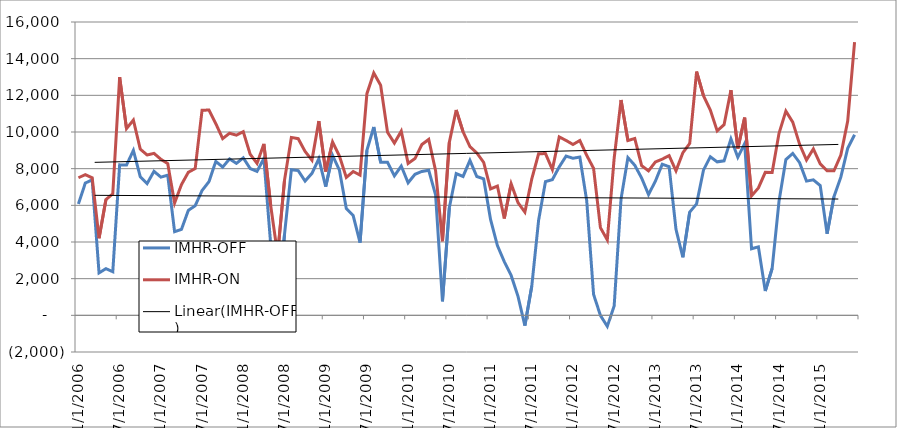
| Category | IMHR-OFF | IMHR-ON |
|---|---|---|
| 1/1/06 | 6076.565 | 7504.472 |
| 2/1/06 | 7214.78 | 7679.468 |
| 3/1/06 | 7390.984 | 7500.795 |
| 4/1/06 | 2314.162 | 4206.245 |
| 5/1/06 | 2545.737 | 6309.301 |
| 6/1/06 | 2380.073 | 6626.586 |
| 7/1/06 | 8207.34 | 12989.126 |
| 8/1/06 | 8197.156 | 10186.404 |
| 9/1/06 | 8995.354 | 10651.316 |
| 10/1/06 | 7564.125 | 9066.866 |
| 11/1/06 | 7188.25 | 8745.414 |
| 12/1/06 | 7854.965 | 8834.357 |
| 1/1/07 | 7539.033 | 8513.194 |
| 2/1/07 | 7644.48 | 8277.216 |
| 3/1/07 | 4561.361 | 6126.327 |
| 4/1/07 | 4689.67 | 7130.97 |
| 5/1/07 | 5724.833 | 7802.816 |
| 6/1/07 | 5980.364 | 8007.269 |
| 7/1/07 | 6808.305 | 11188.867 |
| 8/1/07 | 7288.511 | 11195.866 |
| 9/1/07 | 8396.359 | 10456.195 |
| 10/1/07 | 8085.724 | 9639.919 |
| 11/1/07 | 8530.538 | 9931.176 |
| 12/1/07 | 8290.111 | 9827.297 |
| 1/1/08 | 8589.036 | 10015.242 |
| 2/1/08 | 8007.624 | 8791.733 |
| 3/1/08 | 7851.382 | 8288.801 |
| 4/1/08 | 8555.825 | 9349.29 |
| 5/1/08 | 3832.882 | 5965.396 |
| 6/1/08 | 149.942 | 3302.464 |
| 7/1/08 | 4397.79 | 7364.334 |
| 8/1/08 | 7944.923 | 9705.77 |
| 9/1/08 | 7893.869 | 9635.211 |
| 10/1/08 | 7329.267 | 8942.723 |
| 11/1/08 | 7742.935 | 8467.855 |
| 12/1/08 | 8538.709 | 10594.966 |
| 1/1/09 | 7020.312 | 7845.517 |
| 2/1/09 | 8719.633 | 9452.94 |
| 3/1/09 | 7918.339 | 8685.84 |
| 4/1/09 | 5827.679 | 7526.827 |
| 5/1/09 | 5441.2 | 7842.865 |
| 6/1/09 | 3964.789 | 7644.264 |
| 7/1/09 | 9001.425 | 12090.755 |
| 8/1/09 | 10271.799 | 13220.015 |
| 9/1/09 | 8345.746 | 12545.55 |
| 10/1/09 | 8350.096 | 9988.01 |
| 11/1/09 | 7609.508 | 9399.159 |
| 12/1/09 | 8144.601 | 10046.538 |
| 1/1/10 | 7232.146 | 8287.236 |
| 2/1/10 | 7690.06 | 8548.982 |
| 3/1/10 | 7848.366 | 9318.975 |
| 4/1/10 | 7910.887 | 9594.842 |
| 5/1/10 | 6568.074 | 7891.826 |
| 6/1/10 | 766.696 | 4041.104 |
| 7/1/10 | 5864.71 | 9437.136 |
| 8/1/10 | 7734.879 | 11202.661 |
| 9/1/10 | 7576.091 | 10012.473 |
| 10/1/10 | 8450.953 | 9207.715 |
| 11/1/10 | 7572.689 | 8857.099 |
| 12/1/10 | 7442.129 | 8343.083 |
| 1/1/11 | 5229.274 | 6900.103 |
| 2/1/11 | 3805.549 | 7054.983 |
| 3/1/11 | 2931.086 | 5282.628 |
| 4/1/11 | 2177.727 | 7174.334 |
| 5/1/11 | 1037.269 | 6144.66 |
| 6/1/11 | -560.884 | 5629.52 |
| 7/1/11 | 1582.746 | 7433.902 |
| 8/1/11 | 5188.702 | 8818.644 |
| 9/1/11 | 7294.896 | 8821.181 |
| 10/1/11 | 7399.79 | 7955.901 |
| 11/1/11 | 8096.763 | 9732.072 |
| 12/1/11 | 8685.873 | 9538.119 |
| 1/1/12 | 8567.891 | 9320.123 |
| 2/1/12 | 8633.452 | 9535.164 |
| 3/1/12 | 6261.405 | 8726.52 |
| 4/1/12 | 1143.035 | 8019.476 |
| 5/1/12 | -6.784 | 4780.589 |
| 6/1/12 | -601.678 | 4111.776 |
| 7/1/12 | 521.512 | 8570.833 |
| 8/1/12 | 6348.46 | 11745.86 |
| 9/1/12 | 8602.301 | 9533.183 |
| 10/1/12 | 8184.901 | 9646.182 |
| 11/1/12 | 7486.882 | 8163.346 |
| 12/1/12 | 6589.309 | 7880.084 |
| 1/1/13 | 7317.394 | 8366.159 |
| 2/1/13 | 8241.88 | 8519.162 |
| 3/1/13 | 8107.695 | 8712.527 |
| 4/1/13 | 4691.745 | 7882.654 |
| 5/1/13 | 3163.965 | 8867.999 |
| 6/1/13 | 5632.395 | 9377.654 |
| 7/1/13 | 6078.637 | 13295.289 |
| 8/1/13 | 7919.556 | 11985.202 |
| 9/1/13 | 8653.948 | 11195.054 |
| 10/1/13 | 8371.458 | 10061.237 |
| 11/1/13 | 8426.524 | 10398.182 |
| 12/1/13 | 9626.568 | 12285.485 |
| 1/1/14 | 8618.385 | 9091.096 |
| 2/1/14 | 9367.997 | 10783.779 |
| 3/1/14 | 3629.843 | 6515.266 |
| 4/1/14 | 3732.272 | 6947.39 |
| 5/1/14 | 1328.624 | 7800.424 |
| 6/1/14 | 2557.092 | 7795.045 |
| 7/1/14 | 6223.559 | 9926.999 |
| 8/1/14 | 8496.575 | 11135.929 |
| 9/1/14 | 8829.462 | 10540.874 |
| 10/1/14 | 8329.52 | 9326.497 |
| 11/1/14 | 7321.042 | 8472.303 |
| 12/1/14 | 7394.59 | 9077.056 |
| 1/1/15 | 7078.445 | 8267.384 |
| 2/1/15 | 4453.519 | 7886.496 |
| 3/1/15 | 6470.637 | 7881.4 |
| 4/1/15 | 7537.089 | 8736.288 |
| 5/1/15 | 9111.729 | 10592.903 |
| 6/1/15 | 9848.793 | 14901.564 |